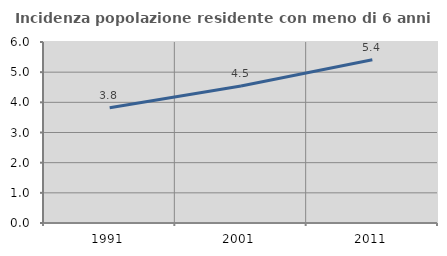
| Category | Incidenza popolazione residente con meno di 6 anni |
|---|---|
| 1991.0 | 3.818 |
| 2001.0 | 4.544 |
| 2011.0 | 5.412 |